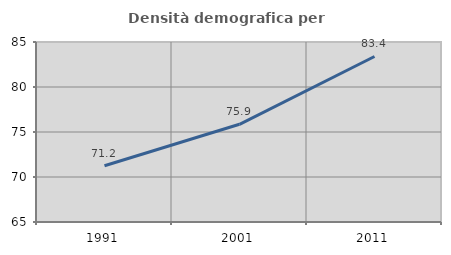
| Category | Densità demografica |
|---|---|
| 1991.0 | 71.244 |
| 2001.0 | 75.857 |
| 2011.0 | 83.391 |